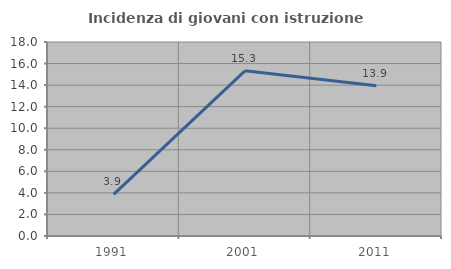
| Category | Incidenza di giovani con istruzione universitaria |
|---|---|
| 1991.0 | 3.865 |
| 2001.0 | 15.323 |
| 2011.0 | 13.93 |